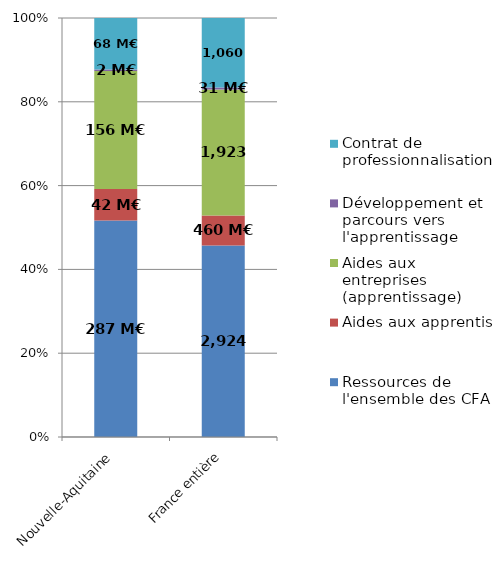
| Category | Ressources de l'ensemble des CFA | Aides aux apprentis | Aides aux entreprises (apprentissage) | Développement et parcours vers l'apprentissage | Contrat de professionnalisation |
|---|---|---|---|---|---|
| Nouvelle-Aquitaine | 287.113 | 41.706 | 156.348 | 1.806 | 68.406 |
| France entière | 2924.219 | 459.796 | 1923.184 | 31.421 | 1060.48 |